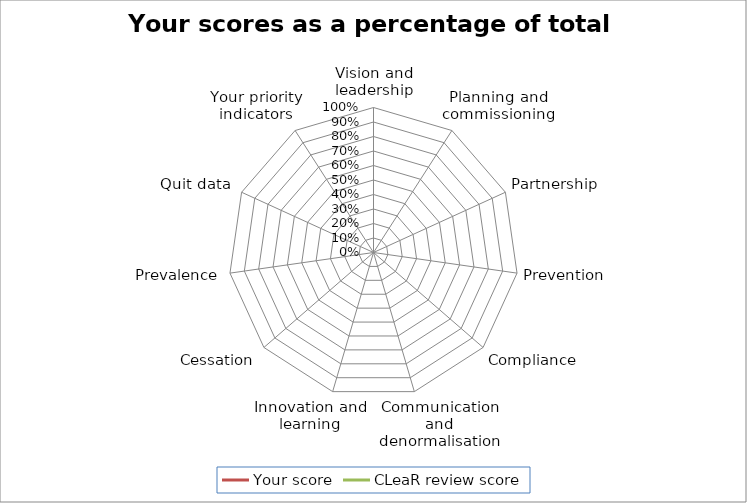
| Category | Your score | CLeaR review score |
|---|---|---|
| Vision and leadership | 0 | 0 |
| Planning and commissioning | 0 | 0 |
| Partnership | 0 | 0 |
| Prevention | 0 | 0 |
| Compliance | 0 | 0 |
| Communication and denormalisation | 0 | 0 |
| Innovation and learning | 0 | 0 |
| Cessation | 0 | 0 |
| Prevalence | 0 | 0 |
| Quit data | 0 | 0 |
| Your priority indicators | 0 | 0 |